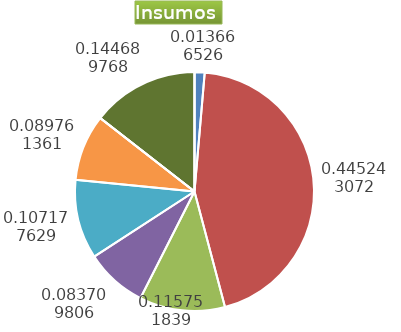
| Category | Series 0 |
|---|---|
| Control arvenses | 102380 |
| Control fitosanitario | 3335448 |
| Cosecha y beneficio | 867131.38 |
| Fertilización | 627095 |
| Instalación | 802899.426 |
| Otros | 672429 |
| Podas | 0 |
| Riego | 0 |
| Transporte | 1083914 |
| Tutorado | 0 |